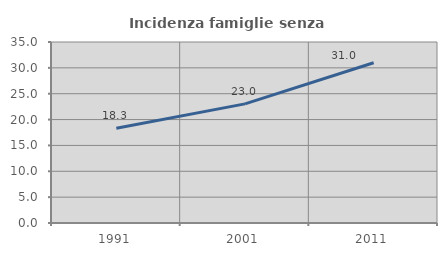
| Category | Incidenza famiglie senza nuclei |
|---|---|
| 1991.0 | 18.328 |
| 2001.0 | 23.037 |
| 2011.0 | 30.99 |